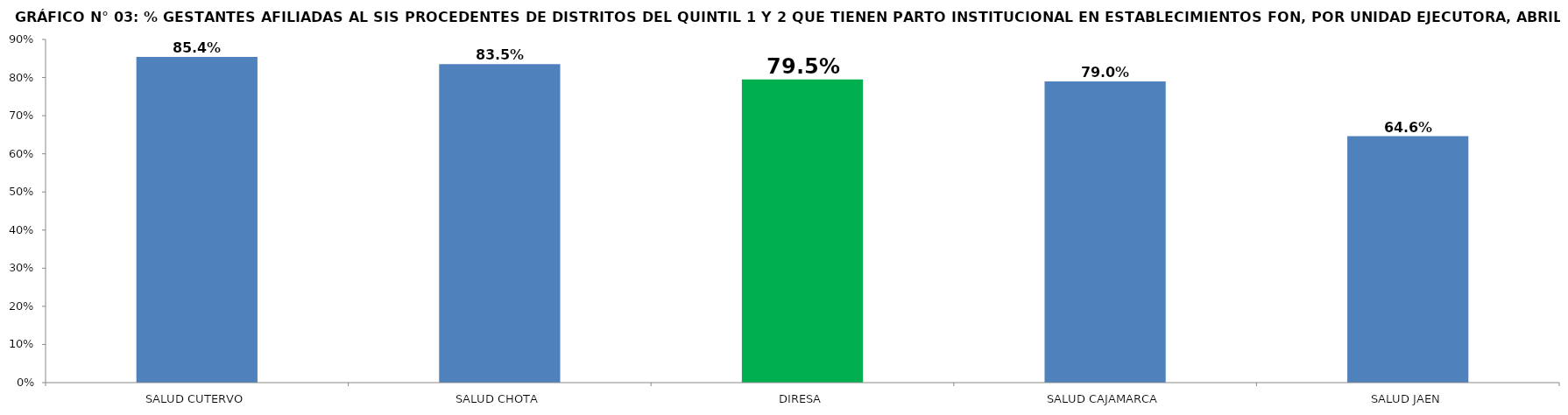
| Category | % GESTANTES AFILIADAS AL SIS PROCEDENTES DE DISTRITOS DEL QUINTIL 1 Y 2 QUE TIENEN PARTO INSTITUCIONAL EN ESTABLECIMIENTOS FON |
|---|---|
| SALUD CUTERVO | 0.854 |
| SALUD CHOTA | 0.835 |
| DIRESA | 0.795 |
| SALUD CAJAMARCA | 0.79 |
| SALUD JAEN | 0.646 |